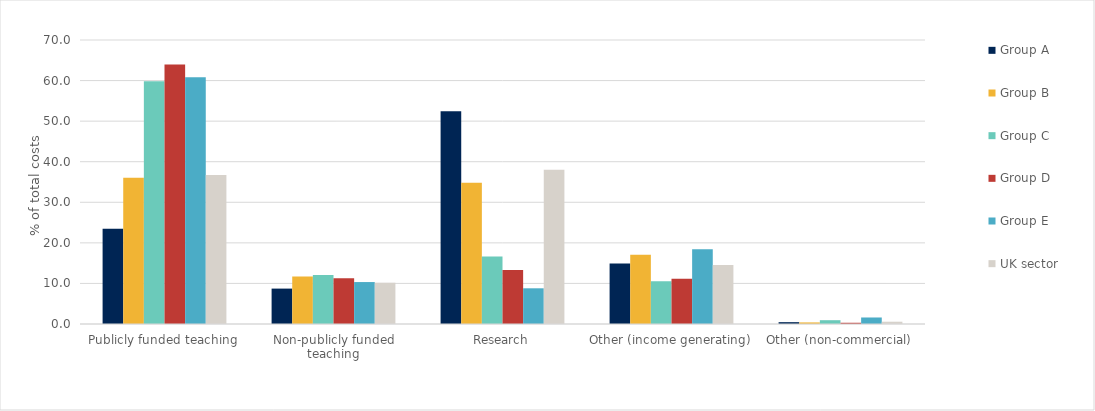
| Category | Group A | Group B | Group C | Group D | Group E | UK sector |
|---|---|---|---|---|---|---|
| Publicly funded teaching | 23.466 | 36.028 | 59.831 | 63.959 | 60.81 | 36.725 |
| Non-publicly funded teaching | 8.725 | 11.701 | 12.05 | 11.27 | 10.339 | 10.173 |
| Research | 52.421 | 34.799 | 16.627 | 13.331 | 8.799 | 38.025 |
| Other (income generating) | 14.935 | 17.08 | 10.556 | 11.136 | 18.447 | 14.514 |
| Other (non-commercial) | 0.452 | 0.392 | 0.937 | 0.304 | 1.605 | 0.563 |